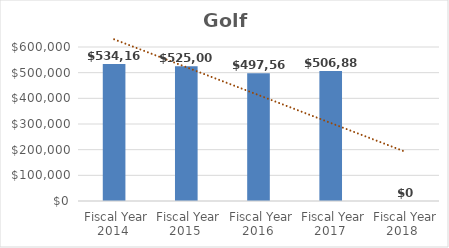
| Category | Golf Course |
|---|---|
| Fiscal Year 2014 | 534165 |
| Fiscal Year 2015 | 525000 |
| Fiscal Year 2016 | 497564 |
| Fiscal Year 2017 | 506889 |
| Fiscal Year 2018 | 0 |